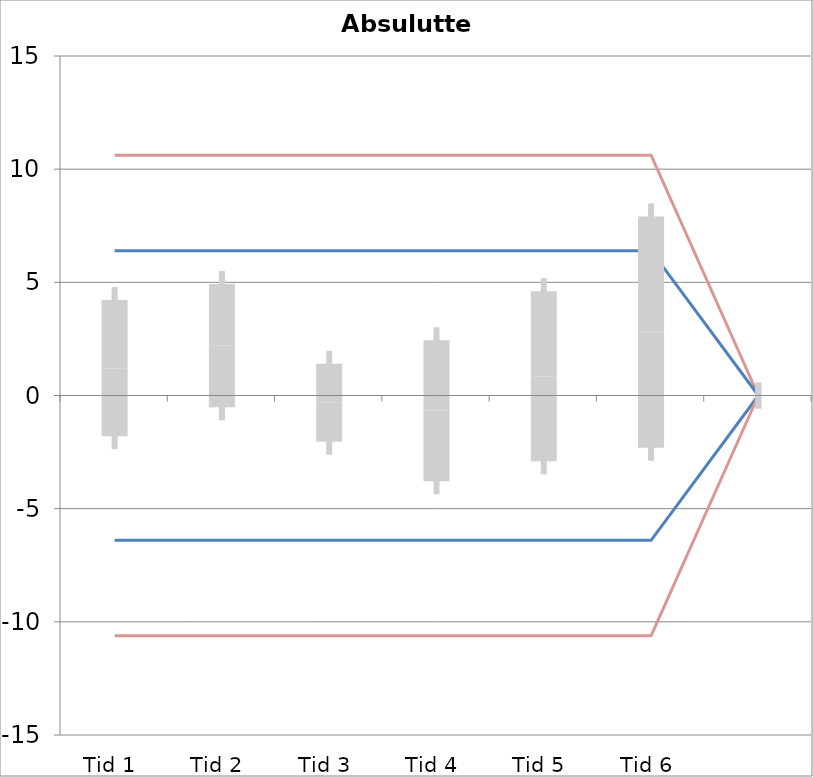
| Category | 1 | 2 | 3 | 4 | 5 | 6 | 7 | 8 | 9 | 10 | 11 | 12 | 13 | 14 | 15 | 16 | 17 | 18 | 19 | 20 | TEa | B | -B | -TEa | M |
|---|---|---|---|---|---|---|---|---|---|---|---|---|---|---|---|---|---|---|---|---|---|---|---|---|---|
| Tid 1 | 4.4 | -6.9 | 0.8 | -0.5 | -3.9 | 0 | -0.3 | -0.8 | 2.8 | 7.9 | 2.2 | 7.6 | 0 | 0 | 0 | 0 | 0 | 0 | 0 | 0 | 10.618 | 6.397 | -6.397 | -10.618 | 1.209 |
| Tid 2 | 3.9 | -1.6 | 6.5 | -1.3 | 0 | -2.2 | -1.9 | 4.6 | 2.9 | 3.1 | -0.2 | 10.4 | 0 | 0 | 0 | 0 | 0 | 0 | 0 | 0 | 10.618 | 6.397 | -6.397 | -10.618 | 2.2 |
| Tid 3 | 1.8 | 0 | -1.9 | 3.3 | 0 | -3.3 | -1.8 | 2 | -2.3 | 2.3 | -2.4 | -0.9 | 0 | 0 | 0 | 0 | 0 | 0 | 0 | 0 | 10.618 | 6.397 | -6.397 | -10.618 | -0.32 |
| Tid 4 | 3.1 | -3.5 | -1.6 | -5 | 0 | -9.8 | -2 | 0.3 | 2 | 3.8 | -1.7 | 7 | 0 | 0 | 0 | 0 | 0 | 0 | 0 | 0 | 10.618 | 6.397 | -6.397 | -10.618 | -0.673 |
| Tid 5 | 3.3 | 1.6 | 4.5 | 2.6 | 0 | -4.9 | 0 | 0 | 0 | -2 | 0 | 0 | 0 | 0 | 0 | 0 | 0 | 0 | 0 | 0 | 10.618 | 6.397 | -6.397 | -10.618 | 0.85 |
| Tid 6 | 0 | 0 | 0 | 0 | 0 | 0 | 5.9 | 6.3 | 4.6 | 2.2 | -6.7 | 4.5 | 0 | 0 | 0 | 0 | 0 | 0 | 0 | 0 | 10.618 | 6.397 | -6.397 | -10.618 | 2.8 |